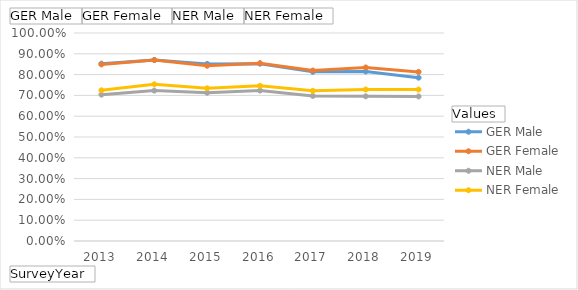
| Category | GER Male | GER Female | NER Male | NER Female |
|---|---|---|---|---|
| 2013 | 0.853 | 0.849 | 0.704 | 0.725 |
| 2014 | 0.87 | 0.87 | 0.723 | 0.753 |
| 2015 | 0.851 | 0.843 | 0.713 | 0.734 |
| 2016 | 0.853 | 0.855 | 0.723 | 0.746 |
| 2017 | 0.813 | 0.82 | 0.697 | 0.722 |
| 2018 | 0.815 | 0.834 | 0.696 | 0.728 |
| 2019 | 0.785 | 0.813 | 0.695 | 0.728 |